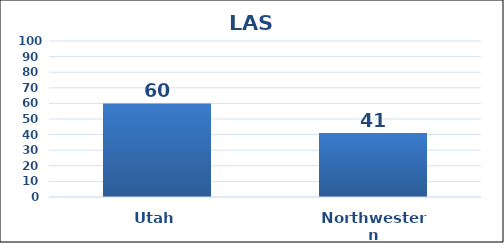
| Category | Series 0 |
|---|---|
| Utah | 60 |
| Northwestern | 41 |